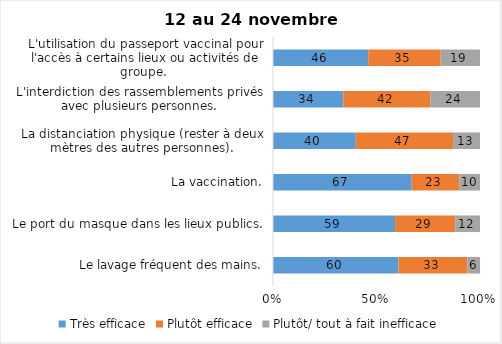
| Category | Très efficace | Plutôt efficace | Plutôt/ tout à fait inefficace |
|---|---|---|---|
| Le lavage fréquent des mains. | 60 | 33 | 6 |
| Le port du masque dans les lieux publics. | 59 | 29 | 12 |
| La vaccination. | 67 | 23 | 10 |
| La distanciation physique (rester à deux mètres des autres personnes). | 40 | 47 | 13 |
| L'interdiction des rassemblements privés avec plusieurs personnes. | 34 | 42 | 24 |
| L'utilisation du passeport vaccinal pour l'accès à certains lieux ou activités de groupe.  | 46 | 35 | 19 |